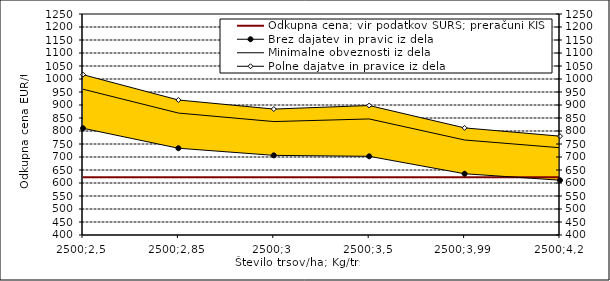
| Category | Odkupna cena; vir podatkov SURS; preračuni KIS |
|---|---|
| 2500;2,5 | 622.39 |
| 2500;2,85 | 622.39 |
| 2500;3 | 622.39 |
| 2500;3,5 | 622.39 |
| 2500;3,99 | 622.39 |
| 2500;4,2 | 622.39 |